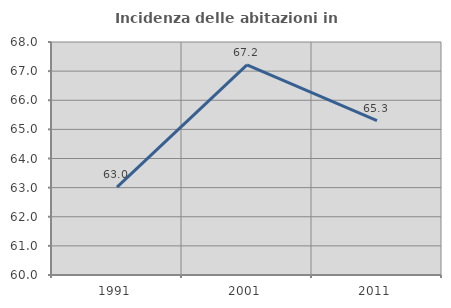
| Category | Incidenza delle abitazioni in proprietà  |
|---|---|
| 1991.0 | 63.019 |
| 2001.0 | 67.214 |
| 2011.0 | 65.304 |